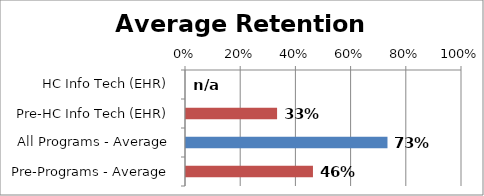
| Category | Series 0 |
|---|---|
| HC Info Tech (EHR) | 0 |
| Pre-HC Info Tech (EHR) | 0.33 |
| All Programs - Average | 0.73 |
| Pre-Programs - Average | 0.46 |